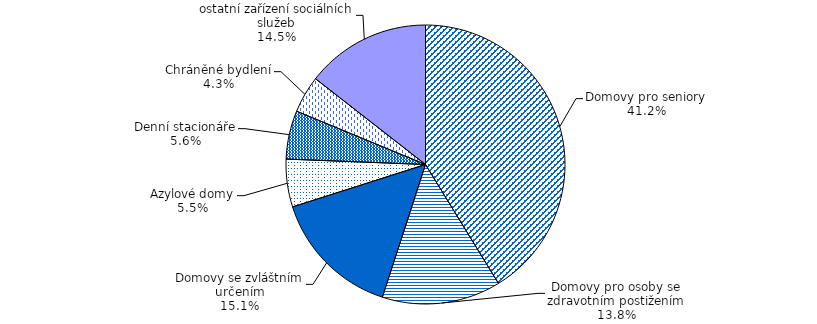
| Category | Series 0 |
|---|---|
| Domovy pro seniory | 998 |
| Domovy pro osoby se zdravotním postižením | 333 |
| Domovy se zvláštním určením | 365 |
| Azylové domy | 134 |
| Denní stacionáře | 136 |
| Chráněné bydlení | 104 |
| ostatní zařízení sociálních služeb | 350 |